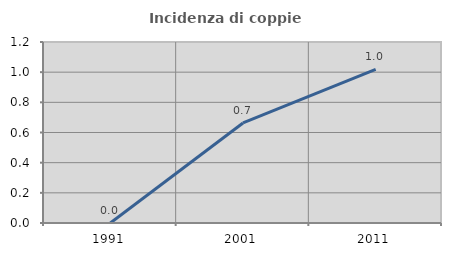
| Category | Incidenza di coppie miste |
|---|---|
| 1991.0 | 0 |
| 2001.0 | 0.663 |
| 2011.0 | 1.018 |